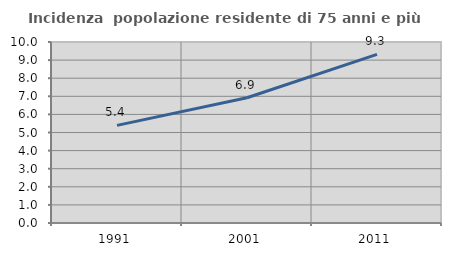
| Category | Incidenza  popolazione residente di 75 anni e più |
|---|---|
| 1991.0 | 5.393 |
| 2001.0 | 6.92 |
| 2011.0 | 9.32 |